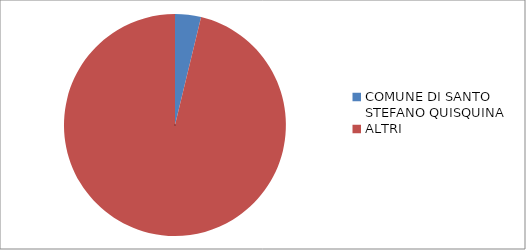
| Category | Series 0 |
|---|---|
| COMUNE DI SANTO STEFANO QUISQUINA | 3.78 |
| ALTRI | 96.22 |